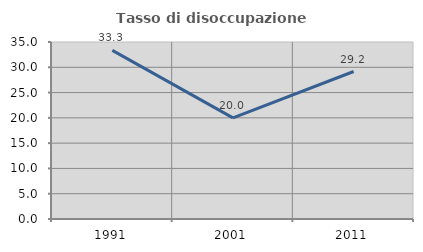
| Category | Tasso di disoccupazione giovanile  |
|---|---|
| 1991.0 | 33.333 |
| 2001.0 | 20 |
| 2011.0 | 29.167 |